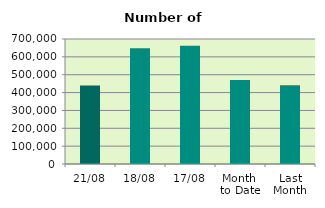
| Category | Series 0 |
|---|---|
| 21/08 | 438922 |
| 18/08 | 647526 |
| 17/08 | 662140 |
| Month 
to Date | 469981.467 |
| Last
Month | 440756.667 |